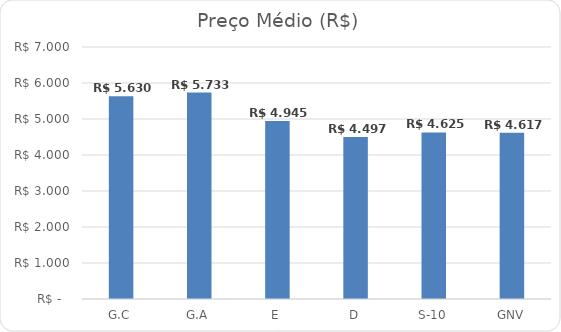
| Category | Series 0 |
|---|---|
| G.C | 5.63 |
| G.A | 5.733 |
| E | 4.945 |
| D | 4.497 |
| S-10 | 4.625 |
| GNV | 4.617 |